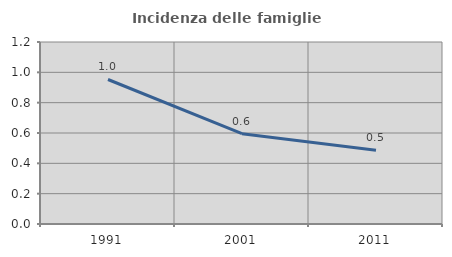
| Category | Incidenza delle famiglie numerose |
|---|---|
| 1991.0 | 0.953 |
| 2001.0 | 0.595 |
| 2011.0 | 0.486 |